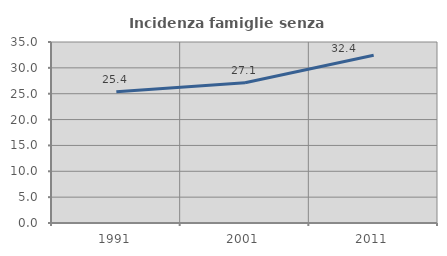
| Category | Incidenza famiglie senza nuclei |
|---|---|
| 1991.0 | 25.397 |
| 2001.0 | 27.114 |
| 2011.0 | 32.439 |